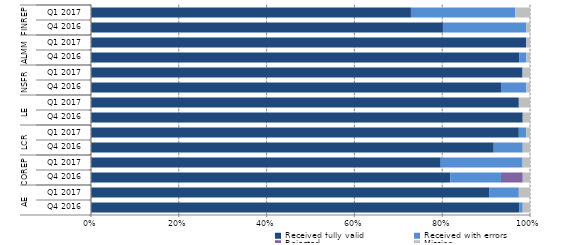
| Category | Received fully valid | Received with errors | Rejected | Missing |
|---|---|---|---|---|
| 0 | 118 | 1 | 0 | 2 |
| 1 | 107 | 8 | 0 | 3 |
| 2 | 99 | 14 | 6 | 2 |
| 3 | 94 | 22 | 0 | 2 |
| 4 | 111 | 8 | 0 | 2 |
| 5 | 115 | 2 | 0 | 1 |
| 6 | 119 | 0 | 0 | 2 |
| 7 | 115 | 0 | 0 | 3 |
| 8 | 113 | 7 | 0 | 1 |
| 9 | 116 | 0 | 0 | 2 |
| 10 | 118 | 2 | 0 | 1 |
| 11 | 117 | 0 | 0 | 1 |
| 12 | 97 | 23 | 0 | 1 |
| 13 | 86 | 28 | 0 | 4 |